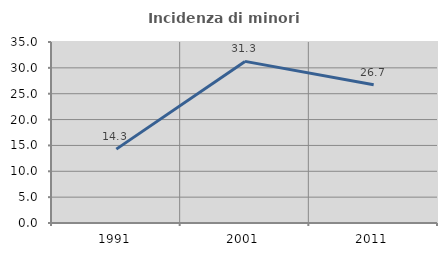
| Category | Incidenza di minori stranieri |
|---|---|
| 1991.0 | 14.286 |
| 2001.0 | 31.25 |
| 2011.0 | 26.733 |